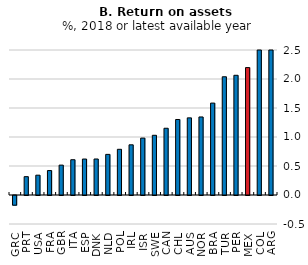
| Category | Series 0 |
|---|---|
| GRC | -0.167 |
| PRT | 0.316 |
| USA | 0.342 |
| FRA | 0.422 |
| GBR | 0.515 |
| ITA | 0.608 |
| ESP | 0.62 |
| DNK | 0.621 |
| NLD | 0.7 |
| POL | 0.788 |
| IRL | 0.865 |
| ISR | 0.981 |
| SWE | 1.03 |
| CAN | 1.151 |
| CHL | 1.302 |
| AUS | 1.33 |
| NOR | 1.345 |
| BRA | 1.585 |
| TUR | 2.038 |
| PER | 2.064 |
| MEX | 2.197 |
| COL | 2.57 |
| ARG | 5.141 |